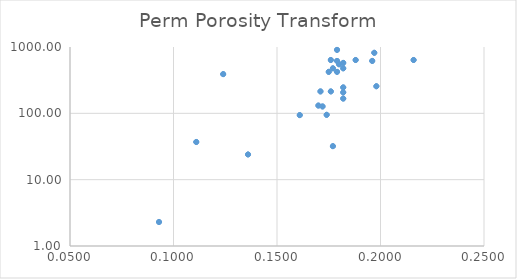
| Category | Series 0 |
|---|---|
| 0.177 | 32 |
| 0.247 | 0 |
| 0.182 | 207 |
| 0.172 | 127 |
| 0.18 | 549 |
| 0.179 | 905 |
| 0.182 | 167 |
| 0.179 | 617 |
| 0.198 | 256 |
| 0.21600000000000003 | 637 |
| 0.124 | 390 |
| 0.188 | 637 |
| 0.19699999999999998 | 818 |
| 0.196 | 617 |
| 0.17600000000000002 | 637 |
| 0.09300000000000001 | 2.3 |
| 0.111 | 37 |
| 0.136 | 24 |
| 0.16899999999999998 | 0 |
| 0.174 | 95 |
| 0.161 | 94 |
| 0.171 | 214 |
| 0.17 | 131 |
| 0.17600000000000002 | 214 |
| 0.179 | 422 |
| 0.175 | 422 |
| 0.177 | 477 |
| 0.182 | 576 |
| 0.182 | 246 |
| 0.182 | 477 |
| 0.177 | 32 |
| 0.247 | 0 |
| 0.182 | 207 |
| 0.172 | 127 |
| 0.18 | 549 |
| 0.179 | 905 |
| 0.182 | 167 |
| 0.179 | 617 |
| 0.198 | 256 |
| 0.21600000000000003 | 637 |
| 0.124 | 390 |
| 0.188 | 637 |
| 0.19699999999999998 | 818 |
| 0.196 | 617 |
| 0.17600000000000002 | 637 |
| 0.09300000000000001 | 2.3 |
| 0.111 | 37 |
| 0.136 | 24 |
| 0.16899999999999998 | 0 |
| 0.174 | 95 |
| 0.161 | 94 |
| 0.171 | 214 |
| 0.17 | 131 |
| 0.17600000000000002 | 214 |
| 0.179 | 422 |
| 0.175 | 422 |
| 0.177 | 477 |
| 0.182 | 576 |
| 0.182 | 246 |
| 0.182 | 477 |